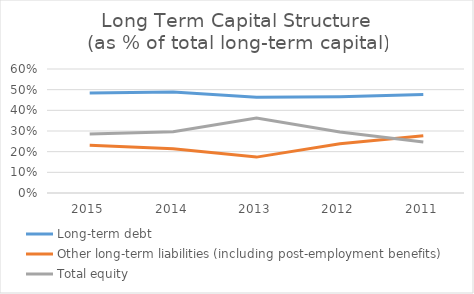
| Category | Long-term debt | Other long-term liabilities (including post-employment benefits) | Total equity |
|---|---|---|---|
| 2015.0 | 0.484 | 0.231 | 0.285 |
| 2014.0 | 0.489 | 0.215 | 0.296 |
| 2013.0 | 0.464 | 0.174 | 0.362 |
| 2012.0 | 0.466 | 0.239 | 0.295 |
| 2011.0 | 0.476 | 0.277 | 0.247 |